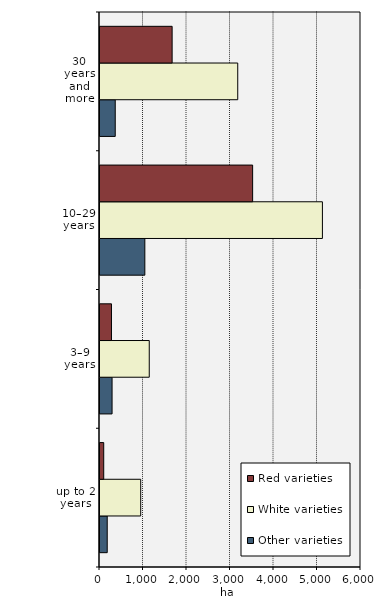
| Category | Other varieties | White varieties | Red varieties |
|---|---|---|---|
| up to 2 years | 166.051 | 935.949 | 85.495 |
| 3–9 years | 277.6 | 1132.219 | 263.967 |
| 10–29 years | 1030.557 | 5113.042 | 3508.774 |
| 30 years and more | 350.318 | 3166.315 | 1658.302 |